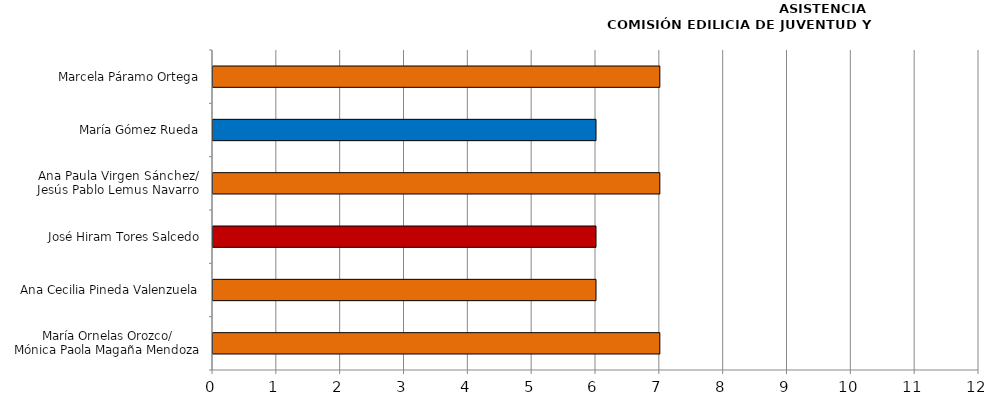
| Category | Series 0 |
|---|---|
| María Ornelas Orozco/
Mónica Paola Magaña Mendoza | 7 |
| Ana Cecilia Pineda Valenzuela | 6 |
| José Hiram Tores Salcedo | 6 |
| Ana Paula Virgen Sánchez/
Jesús Pablo Lemus Navarro | 7 |
| María Gómez Rueda | 6 |
| Marcela Páramo Ortega | 7 |